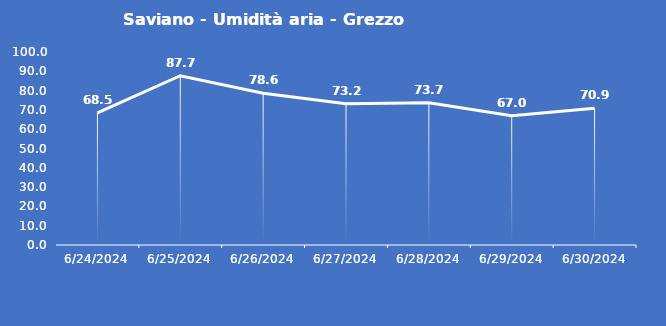
| Category | Saviano - Umidità aria - Grezzo (%) |
|---|---|
| 6/24/24 | 68.5 |
| 6/25/24 | 87.7 |
| 6/26/24 | 78.6 |
| 6/27/24 | 73.2 |
| 6/28/24 | 73.7 |
| 6/29/24 | 67 |
| 6/30/24 | 70.9 |